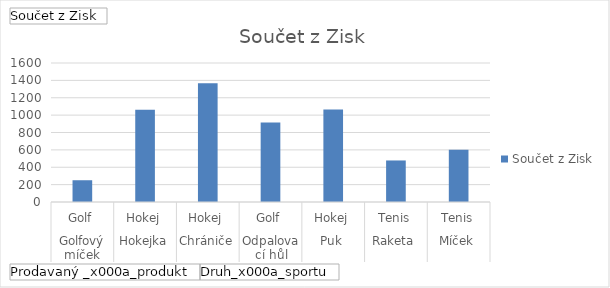
| Category | Celkem |
|---|---|
| 0 | 250.5 |
| 1 | 1060.8 |
| 2 | 1367.4 |
| 3 | 916.5 |
| 4 | 1065 |
| 5 | 478.1 |
| 6 | 602.7 |